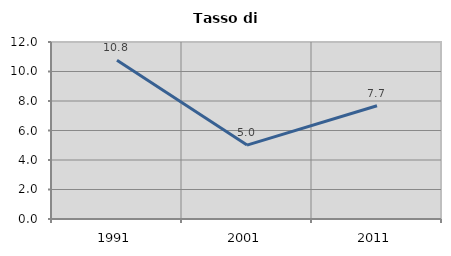
| Category | Tasso di disoccupazione   |
|---|---|
| 1991.0 | 10.764 |
| 2001.0 | 5.011 |
| 2011.0 | 7.678 |